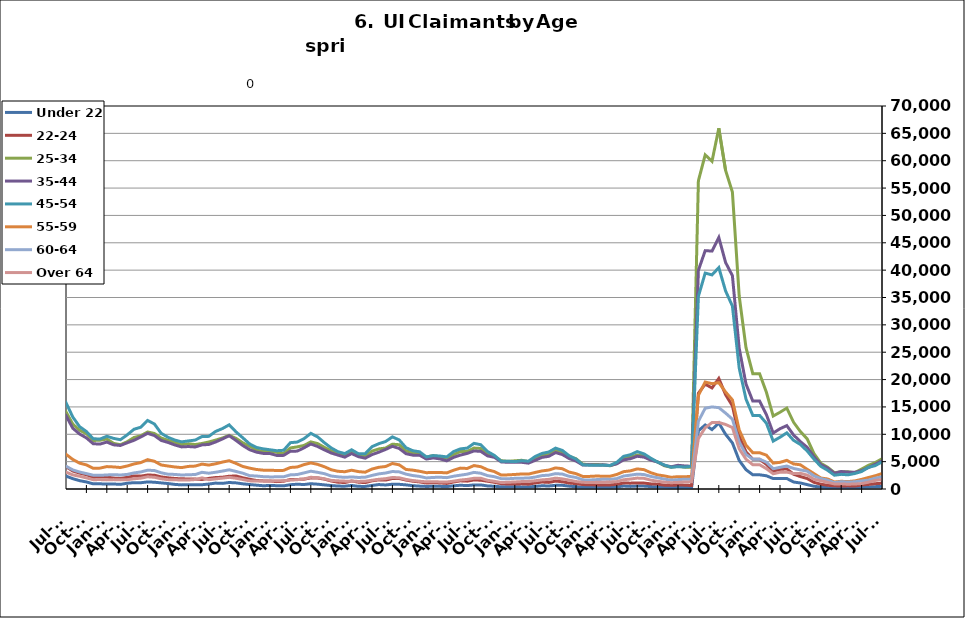
| Category | Under 22 | 22-24 | 25-34 | 35-44 | 45-54 | 55-59 | 60-64 | Over 64 |
|---|---|---|---|---|---|---|---|---|
| 1995-02-28 | 535 | 933 | 5740 | 6206 | 4029 | 1255 | 625 | 276 |
| 1995-03-31 | 534 | 992 | 5856 | 6433 | 4297 | 1294 | 686 | 323 |
| 1995-04-30 | 603 | 1125 | 6814 | 6965 | 4447 | 1392 | 730 | 338 |
| 1995-05-31 | 626 | 1171 | 7442 | 7404 | 4702 | 1383 | 751 | 333 |
| 1995-06-30 | 625 | 1218 | 7514 | 7778 | 4867 | 1435 | 813 | 366 |
| 1995-07-31 | 710 | 1296 | 8612 | 8864 | 5537 | 1595 | 891 | 407 |
| 1995-08-31 | 729 | 1248 | 8185 | 8719 | 5400 | 1604 | 982 | 406 |
| 1995-09-30 | 578 | 1028 | 6615 | 7150 | 4534 | 1351 | 862 | 338 |
| 1995-10-31 | 554 | 957 | 5805 | 6461 | 4159 | 1205 | 741 | 287 |
| 1995-11-30 | 468 | 845 | 5201 | 5826 | 3927 | 1155 | 702 | 254 |
| 1995-12-31 | 517 | 858 | 5350 | 5974 | 4010 | 1153 | 672 | 263 |
| 1996-01-31 | 543 | 927 | 5431 | 6086 | 4208 | 1221 | 685 | 301 |
| 1996-02-29 | 617 | 999 | 5667 | 6535 | 4480 | 1312 | 747 | 305 |
| 1996-03-31 | 622 | 981 | 5896 | 6557 | 4514 | 1362 | 763 | 306 |
| 1996-04-30 | 680 | 1140 | 7032 | 7649 | 5088 | 1527 | 856 | 345 |
| 1996-05-31 | 689 | 1163 | 7220 | 7819 | 5070 | 1521 | 832 | 366 |
| 1996-06-30 | 661 | 1145 | 7344 | 8173 | 5391 | 1568 | 844 | 388 |
| 1996-07-31 | 762 | 1250 | 8375 | 9181 | 6036 | 1755 | 973 | 432 |
| 1996-08-31 | 746 | 1145 | 7829 | 8585 | 5586 | 1651 | 950 | 435 |
| 1996-09-30 | 635 | 992 | 6399 | 7097 | 4790 | 1462 | 804 | 425 |
| 1996-10-31 | 572 | 851 | 5448 | 6291 | 4192 | 1259 | 693 | 340 |
| 1996-11-30 | 531 | 827 | 5003 | 5921 | 3908 | 1153 | 602 | 315 |
| 1996-12-31 | 521 | 789 | 4710 | 5510 | 3673 | 1110 | 610 | 284 |
| 1997-01-31 | 559 | 841 | 5203 | 6172 | 4321 | 1255 | 731 | 328 |
| 1997-02-28 | 556 | 841 | 5187 | 6162 | 4311 | 1250 | 727 | 326 |
| 1997-03-31 | 499 | 806 | 5125 | 6037 | 4176 | 1294 | 702 | 363 |
| 1997-04-30 | 545 | 885 | 5753 | 6709 | 4248 | 1339 | 734 | 339 |
| 1997-05-31 | 612 | 941 | 6146 | 7153 | 4458 | 1348 | 801 | 336 |
| 1997-06-30 | 623 | 995 | 6240 | 7298 | 4662 | 1302 | 776 | 348 |
| 1997-07-31 | 716 | 1154 | 7168 | 8554 | 5489 | 1509 | 903 | 415 |
| 1997-08-31 | 684 | 1072 | 6853 | 8093 | 5222 | 1487 | 837 | 416 |
| 1997-09-30 | 579 | 912 | 5522 | 6592 | 4348 | 1285 | 705 | 380 |
| 1997-10-31 | 516 | 817 | 4894.5 | 5892.5 | 3945 | 1159 | 625 | 344.5 |
| 1997-11-30 | 453 | 722 | 4267 | 5193 | 3542 | 1033 | 545 | 309 |
| 1997-12-31 | 413 | 682 | 3792 | 4755 | 3300 | 1023 | 490 | 266 |
| 1998-01-31 | 489 | 741 | 4044 | 5115 | 3513 | 1099 | 525 | 267 |
| 1998-02-28 | 435 | 684 | 3864 | 4903 | 3549 | 1043 | 571 | 285 |
| 1998-03-31 | 416 | 680 | 3855 | 5086 | 3703 | 1176 | 604 | 297 |
| 1998-04-30 | 592 | 813 | 5092 | 6219 | 4262 | 1336 | 688 | 332 |
| 1998-05-31 | 579 | 849 | 5319 | 6766 | 4554 | 1382 | 729 | 360 |
| 1998-06-30 | 568 | 899 | 5557 | 7101 | 4897 | 1405 | 783 | 367 |
| 1998-07-31 | 691 | 1031 | 6472 | 8095 | 5562 | 1589 | 880 | 392 |
| 1998-08-31 | 673 | 1007 | 6326 | 7950 | 5369 | 1574 | 935 | 393 |
| 1998-09-30 | 548 | 838 | 5206 | 6768 | 4703 | 1432 | 849 | 373 |
| 1998-10-31 | 496 | 776 | 4437 | 5582 | 3875 | 1250 | 711 | 302 |
| 1998-11-30 | 456 | 761 | 4182 | 5332 | 4015 | 1296 | 694 | 308 |
| 1998-12-31 | 442 | 722 | 4010 | 5198 | 4062 | 1331 | 656 | 290 |
| 1999-01-31 | 503 | 830 | 4502 | 5761 | 4521 | 1490 | 751 | 297 |
| 1999-02-28 | 463 | 756 | 4267 | 5576 | 4431 | 1470 | 767 | 301 |
| 1999-03-31 | 435 | 688 | 4119 | 5519 | 4403 | 1516 | 765 | 331 |
| 1999-04-30 | 591 | 949 | 5292 | 7089 | 5468 | 1724 | 914 | 489 |
| 1999-05-31 | 674 | 911 | 5611 | 7459 | 5457 | 1710 | 934 | 500 |
| 1999-06-30 | 640 | 906 | 5660 | 7503 | 5333 | 1695 | 920 | 495 |
| 1999-07-31 | 766 | 1132 | 6820 | 9256 | 6620 | 1981 | 1001 | 549 |
| 1999-08-31 | 738 | 1117 | 6737 | 9030 | 6670 | 2019 | 1075 | 582 |
| 1999-09-30 | 600 | 968 | 5167 | 7169 | 5458 | 1712 | 892 | 465 |
| 1999-10-31 | 494 | 813 | 4501 | 6048 | 4682 | 1443 | 743 | 363 |
| 1999-11-30 | 464 | 768 | 4228 | 5593 | 4564 | 1392 | 702 | 313 |
| 1999-12-31 | 468.5 | 754.5 | 4149 | 5486.5 | 4505 | 1429 | 673 | 304 |
| 2000-01-31 | 473 | 741 | 4070 | 5380 | 4446 | 1466 | 644 | 295 |
| 2000-02-29 | 460 | 691 | 3807 | 5357 | 4470 | 1469 | 707 | 310 |
| 2000-03-31 | 412 | 652 | 3864 | 5499 | 4568 | 1508 | 816 | 389 |
| 2000-04-30 | 585 | 829 | 4741 | 6891 | 5127 | 1631 | 906 | 451 |
| 2000-05-31 | 627 | 875 | 5086 | 7211 | 5238 | 1598 | 956 | 489 |
| 2000-06-30 | 675 | 983 | 5624 | 7826 | 5562 | 1669 | 941 | 524 |
| 2000-07-31 | 802 | 1109 | 6475 | 9102 | 6450 | 1927 | 1097 | 594 |
| 2000-08-31 | 787 | 1058 | 6045 | 8732 | 6157 | 1894 | 1085 | 616 |
| 2000-09-30 | 607 | 897 | 4766 | 6864 | 5037 | 1486 | 902 | 479 |
| 2000-10-31 | 544 | 760 | 4267 | 5897 | 4465 | 1323 | 762 | 394 |
| 2000-11-30 | 535 | 797 | 3982 | 5439 | 4318 | 1256 | 702 | 396 |
| 2000-12-31 | 508 | 832 | 3891 | 5255 | 4218 | 1246 | 694 | 361 |
| 2001-01-31 | 627 | 892 | 4229 | 5724 | 4777 | 1300 | 721 | 393 |
| 2001-02-28 | 643 | 934 | 4553 | 6302 | 5224 | 1529 | 849 | 472 |
| 2001-03-31 | 412 | 648 | 3625 | 5081 | 4551 | 1413 | 778 | 440 |
| 2001-04-30 | 875 | 1276 | 6577 | 8914 | 7196 | 2144 | 1185 | 639 |
| 2001-05-31 | 944 | 1399 | 7133 | 9570 | 7651 | 2265 | 1231 | 679 |
| 2001-06-30 | 1041 | 1584 | 8072 | 11034 | 8621 | 2613 | 1398 | 756 |
| 2001-07-31 | 1135 | 1806 | 9038 | 12514 | 9691 | 2970 | 1611 | 848 |
| 2001-08-31 | 1116 | 1776 | 8753 | 12045 | 9560 | 2963 | 1691 | 898 |
| 2001-09-30 | 1046 | 1705 | 8118 | 11025 | 8788 | 2784 | 1608 | 833 |
| 2001-10-31 | 1094 | 1785 | 8459 | 11114 | 8850 | 2772 | 1610 | 777 |
| 2001-11-30 | 1154 | 1931 | 9131 | 11576 | 9447 | 2973 | 1661 | 778 |
| 2001-12-31 | 1280 | 2191 | 9917 | 11961 | 9905 | 3152 | 1740 | 780 |
| 2002-01-31 | 1330 | 2255 | 10364 | 12730 | 10592 | 3378 | 1843 | 821 |
| 2002-02-28 | 1347 | 2339 | 10349 | 12730 | 10784 | 3499 | 1861 | 867 |
| 2002-03-31 | 1266 | 2231 | 9963 | 12747 | 10614 | 3499 | 1867 | 979 |
| 2002-04-30 | 1412 | 2488 | 11603 | 15825 | 13571 | 4631 | 2389 | 1146 |
| 2002-05-31 | 1455 | 2421 | 11243 | 15509 | 13148 | 4374 | 2359 | 1195 |
| 2002-06-30 | 1534 | 2479 | 11416 | 15594 | 13261 | 4343 | 2365 | 1180 |
| 2002-07-31 | 1513 | 2614 | 11895 | 16242 | 13727 | 4439 | 2428 | 1255 |
| 2002-08-31 | 1022 | 1977 | 8719 | 12054 | 10588 | 3454 | 1990 | 1047 |
| 2002-09-30 | 1391 | 2528 | 10478 | 14010 | 12008 | 3847 | 2161 | 1166 |
| 2002-10-31 | 1401 | 2385 | 9826 | 12727 | 10778 | 3498 | 1886 | 973 |
| 2002-11-30 | 1344 | 2390 | 9846 | 12059 | 10297 | 3367 | 1833 | 958 |
| 2002-12-31 | 1311 | 2403 | 9841 | 11670 | 10177 | 3369 | 1871 | 894 |
| 2003-01-31 | 1311 | 2403 | 9841 | 11670 | 10177 | 3369 | 1871 | 894 |
| 2003-02-28 | 1367 | 2275 | 9730 | 12433 | 10806 | 3687 | 2016 | 974 |
| 2003-03-31 | 1367 | 2357 | 9844 | 12620 | 11167 | 3825 | 2151 | 1094 |
| 2003-04-30 | 1549 | 2525 | 10619 | 14142 | 12182 | 4004 | 2304 | 1190 |
| 2003-05-31 | 1663 | 2698 | 10843 | 14795 | 12539 | 4102 | 2395 | 1256 |
| 2003-06-30 | 1755 | 2770 | 11350 | 15575 | 13251 | 4301 | 2493 | 1325 |
| 2003-07-31 | 1748 | 2791 | 11577 | 15863 | 13772 | 4465 | 2593 | 1371 |
| 2003-08-31 | 1718 | 2653 | 10998 | 15261 | 13219 | 4325 | 2522 | 1359 |
| 2003-09-30 | 1494 | 2521 | 10071 | 13565 | 11659 | 3828 | 2278 | 1286 |
| 2003-10-31 | 1329 | 2432 | 9388 | 12107 | 10693 | 3567 | 2036 | 1129 |
| 2003-11-30 | 1191 | 2226 | 8954 | 11297 | 10037 | 3414 | 2004 | 1068 |
| 2003-12-31 | 1206 | 2184 | 8530 | 10413 | 9335 | 3215 | 1854 | 994 |
| 2004-01-31 | 1216 | 2171 | 8382 | 9858 | 8955 | 2992 | 1736 | 963 |
| 2004-02-29 | 1118 | 1879 | 7614 | 8935 | 8176 | 2761 | 1617 | 943 |
| 2004-03-31 | 1099 | 1749 | 7152 | 8565 | 7769 | 2686 | 1608 | 981 |
| 2004-04-30 | 1241 | 1951 | 7653 | 9981 | 8741 | 2872 | 1685 | 1056 |
| 2004-05-31 | 1245 | 1934 | 7651 | 10203 | 8820 | 2928 | 1703 | 1079 |
| 2004-06-30 | 1316 | 2086 | 8172 | 10636 | 9362 | 3146 | 1843 | 1081 |
| 2004-07-31 | 1476 | 2265 | 8795 | 11511 | 10439 | 3497 | 2008 | 1171 |
| 2004-08-31 | 1390 | 2055 | 8008 | 10418 | 9514 | 3304 | 1909 | 1105 |
| 2004-09-30 | 1129 | 1820 | 6987 | 8661 | 7694 | 2755 | 1623 | 1046 |
| 2004-10-31 | 1037 | 1675 | 6590 | 7964 | 7029 | 2459 | 1461 | 882 |
| 2004-11-30 | 954 | 1638 | 6342 | 7570 | 6733 | 2294 | 1383 | 841 |
| 2004-12-31 | 857 | 1533 | 5921 | 6991 | 6333 | 2225 | 1287 | 764 |
| 2005-01-31 | 893 | 1539 | 6047 | 7410 | 6682 | 2253 | 1274 | 788 |
| 2005-02-28 | 846 | 1361 | 5650 | 6952 | 6404 | 2198 | 1326 | 786 |
| 2005-03-31 | 747 | 1258 | 5313 | 6595 | 6251 | 2151 | 1327 | 742 |
| 2005-04-30 | 877 | 1375 | 5696 | 7717 | 7230 | 2440 | 1401 | 844 |
| 2005-05-31 | 854 | 1408 | 5674 | 7905 | 7454 | 2482 | 1453 | 858 |
| 2005-06-30 | 819 | 1444 | 6028 | 8565 | 7899 | 2613 | 1547 | 890 |
| 2005-07-31 | 900 | 1461 | 6395 | 9124 | 8614 | 2864 | 1640 | 1004 |
| 2005-08-31 | 805 | 1439 | 5917 | 8271 | 8076 | 2692 | 1587 | 945 |
| 2005-09-30 | 631 | 1209 | 4978 | 6413 | 6203 | 2116 | 1312 | 724 |
| 2005-10-31 | 638 | 1134 | 4602 | 6028 | 5688 | 1997 | 1171 | 656 |
| 2005-11-30 | 564 | 1071 | 4409 | 5563 | 5105 | 1791 | 1035 | 580 |
| 2005-12-31 | 523 | 987 | 4014 | 4983 | 4531 | 1673 | 968 | 546 |
| 2006-01-31 | 531 | 925 | 3900 | 5012 | 4793 | 1691 | 1008 | 539 |
| 2006-02-28 | 447 | 804 | 3534 | 4388 | 4403 | 1586 | 980 | 549 |
| 2006-03-31 | 399 | 785 | 3455 | 4472 | 4584 | 1680 | 1069 | 618 |
| 2006-04-30 | 527 | 945 | 4004 | 5859 | 5921 | 1965 | 1251 | 744 |
| 2006-05-31 | 594 | 964 | 4205 | 6365 | 6369 | 2156 | 1327 | 792 |
| 2006-06-30 | 660 | 1113 | 4742 | 7052 | 7094 | 2386 | 1474 | 933 |
| 2006-07-31 | 771 | 1183 | 5214 | 7974 | 8007 | 2685 | 1635 | 1072 |
| 2006-08-31 | 737 | 1202 | 5116 | 7524 | 7553 | 2671 | 1590 | 1019 |
| 2006-09-30 | 596 | 1086 | 4608 | 6175 | 6389 | 2256 | 1287 | 812 |
| 2006-10-31 | 596 | 1056 | 4585 | 5758 | 5788 | 2026 | 1164 | 696 |
| 2006-11-30 | 542 | 1003 | 4370 | 5304 | 5388 | 1812 | 1082 | 604 |
| 2006-12-31 | 553 | 1102 | 4425 | 5291 | 5310 | 1801 | 1099 | 603 |
| 2007-01-31 | 587 | 1147 | 4542 | 5619 | 5506 | 1920 | 1174 | 663 |
| 2007-02-28 | 544 | 1090 | 4490 | 5562 | 5616 | 1982 | 1260 | 705 |
| 2007-03-31 | 558 | 1089 | 4498 | 5595 | 5708 | 2016 | 1378 | 717 |
| 2007-04-30 | 760 | 1203 | 5015 | 6827 | 6871 | 2316 | 1536 | 856 |
| 2007-05-31 | 806 | 1285 | 5542 | 7679 | 7763 | 2571 | 1719 | 1021 |
| 2007-06-30 | 862 | 1340 | 6100 | 8324 | 8341 | 2812 | 1896 | 1060 |
| 2007-07-31 | 980 | 1524 | 6616 | 9184 | 9522 | 3226 | 2038 | 1250 |
| 2007-08-31 | 950 | 1510 | 6266 | 8359 | 8842 | 3033 | 1949 | 1157 |
| 2007-09-30 | 865 | 1595 | 6213 | 7798 | 7957 | 2790 | 1816 | 1090 |
| 2007-10-31 | 883 | 1517 | 6214 | 7229 | 7503 | 2574 | 1630 | 978 |
| 2007-11-15 | 816 | 1424 | 5981 | 6740 | 6999 | 2468 | 1510 | 860 |
| 2007-12-15 09:36:00 | 851 | 1536 | 6411 | 6986 | 7174 | 2572 | 1584 | 874 |
| 2008-01-14 19:12:00 | 963 | 1628 | 6836 | 7533 | 7742 | 2786 | 1744 | 940 |
| 2008-02-14 04:48:00 | 982 | 1565 | 6847 | 7767 | 8031 | 2958 | 1823 | 985 |
| 2008-03-15 14:24:00 | 1029 | 1666 | 7210 | 8036 | 8353 | 3105 | 1898 | 1085 |
| 2008-04-15 | 1182 | 1889 | 7894 | 9339 | 9822 | 3537 | 2184 | 1246 |
| 2008-05-15 09:36:00 | 1325 | 2099 | 8651 | 10315 | 11003 | 3871 | 2423 | 1448 |
| 2008-06-14 19:12:00 | 1405 | 2238 | 9567 | 11330 | 12040 | 4322 | 2650 | 1572 |
| 2008-07-15 04:48:00 | 1616 | 2488 | 10336 | 12349 | 13396 | 4698 | 3083 | 1801 |
| 2008-08-14 14:24:00 | 1753 | 2665 | 10716 | 12486 | 13444 | 4795 | 3139 | 1802 |
| 2008-09-14 | 1800 | 2924 | 11552 | 12686 | 13602 | 4801 | 3180 | 1811 |
| 2008-10-14 09:36:00 | 1936 | 3131 | 12284 | 13322 | 13831 | 4989 | 3183 | 1808 |
| 2008-11-13 19:12:00 | 2093 | 3414 | 13577 | 14724 | 15130 | 5413 | 3440 | 1946 |
| 2008-12-14 04:48:00 | 2495 | 4020 | 15380 | 16325 | 16846 | 6098 | 3755 | 2155 |
| 2009-01-13 14:24:00 | 3054 | 4678 | 17678 | 18452 | 19095 | 6788 | 4182 | 2364 |
| 2009-02-13 | 3531 | 5304 | 19793 | 20788 | 21601 | 7727 | 4836 | 2718 |
| 2009-03-15 09:36:00 | 3891 | 5925 | 22303 | 23139 | 24352 | 8876 | 5515 | 3141 |
| 2009-04-14 19:12:00 | 4291 | 6403 | 23925 | 25362 | 26817 | 9618 | 6020 | 3494 |
| 2009-05-15 04:48:00 | 4410 | 6521 | 24301 | 25794 | 27238 | 9735 | 6181 | 3529 |
| 2009-06-14 14:24:00 | 4405 | 6853 | 25234 | 26806 | 28296 | 10256 | 6673 | 3804 |
| 2009-07-15 | 4729 | 7280 | 26132 | 27836 | 29724 | 10830 | 6950 | 4125 |
| 2009-08-14 09:36:00 | 4717 | 7069 | 25281 | 26184 | 27877 | 10164 | 6719 | 3918 |
| 2009-09-13 19:12:00 | 4741 | 7291 | 25029 | 24981 | 26018 | 9679 | 6210 | 3594 |
| 2009-10-14 04:48:00 | 4656 | 7051 | 24241 | 23779 | 24730 | 9034 | 5817 | 3422 |
| 2009-11-13 14:24:00 | 4421 | 6817 | 23760 | 22851 | 23515 | 8627 | 5549 | 3297 |
| 2009-12-14 | 4232 | 6586 | 23118 | 22038 | 22501 | 8496 | 5370 | 3295 |
| 2010-01-13 09:36:00 | 4276 | 6583 | 22706 | 21421 | 22132 | 8135 | 5154 | 3134 |
| 2010-02-12 19:12:00 | 4133 | 6142 | 21386 | 20012 | 21036 | 7728 | 5039 | 3047 |
| 2010-03-15 04:48:00 | 3784 | 5822 | 20418 | 19073 | 20556 | 7446 | 4983 | 3062 |
| 2010-04-14 14:24:00 | 3731 | 5751 | 20058 | 19261 | 21012 | 7449 | 5078 | 2936 |
| 2010-05-15 | 3516 | 5553 | 19393 | 18793 | 20409 | 7213 | 4923 | 2915 |
| 2010-06-14 09:36:00 | 3450 | 5640 | 19615 | 19385 | 20781 | 7547 | 5293 | 3043 |
| 2010-07-14 19:12:00 | 3536 | 5781 | 19820 | 19714 | 21269 | 7946 | 5439 | 3330 |
| 2010-08-14 04:48:00 | 3477 | 5590 | 18902 | 18548 | 19686 | 7561 | 5039 | 3181 |
| 2010-09-13 14:24:00 | 3083 | 5332 | 17344 | 16712 | 17408 | 6775 | 4612 | 2859 |
| 2010-10-14 | 3004 | 5138 | 17187 | 16492 | 17042 | 6713 | 4418 | 2779 |
| 2010-11-13 09:36:00 | 2724 | 4771 | 16387 | 15438 | 16061 | 6360 | 4209 | 2601 |
| 2010-12-13 19:12:00 | 2335 | 4159 | 15175 | 14143 | 14646 | 5823 | 4003 | 2480 |
| 2011-01-13 04:48:00 | 2530 | 4343 | 15492 | 14596 | 15561 | 6250 | 4059 | 2487 |
| 2011-02-12 14:24:00 | 2609 | 4202 | 15131 | 14142 | 15320 | 6044 | 4041 | 2517 |
| 2011-03-15 | 2290 | 3998 | 14370 | 13505 | 14523 | 5925 | 3990 | 2470 |
| 2011-04-14 09:36:00 | 2563 | 4190 | 14834 | 14445 | 15508 | 6130 | 3916 | 2488 |
| 2011-05-14 19:12:00 | 2642 | 4217 | 14917 | 14494 | 16051 | 6156 | 4129 | 2602 |
| 2011-06-14 04:48:00 | 2767 | 4676 | 17673 | 17404 | 19563 | 7763 | 5398 | 3653 |
| 2011-07-14 14:24:00 | 3027 | 4815 | 17530 | 17197 | 19880 | 7870 | 5384 | 3686 |
| 2011-08-14 | 2900 | 4498 | 15970 | 15020 | 17035 | 6697 | 4394 | 2956 |
| 2011-09-13 09:36:00 | 2531 | 4156 | 14609 | 13818 | 15092 | 5903 | 3881 | 2687 |
| 2011-10-13 19:12:00 | 2452 | 3959 | 14501 | 13415 | 14565 | 5635 | 3734 | 2491 |
| 2011-11-13 04:48:00 | 2197 | 3615 | 13732 | 12410 | 13698 | 5345 | 3574 | 2339 |
| 2011-12-13 14:24:00 | 1938 | 3290 | 13130 | 11646 | 13054 | 5089 | 3380 | 2177 |
| 2012-01-13 | 2098 | 3424 | 13293 | 11897 | 13400 | 5218 | 3448 | 2197 |
| 2012-02-12 09:36:00 | 2047 | 3428 | 12569 | 11400 | 12931 | 5177 | 3445 | 2212 |
| 2012-03-13 19:12:00 | 1870 | 3252 | 11913 | 10922 | 12476 | 4948 | 3317 | 2155 |
| 2012-04-13 04:48:00 | 2063 | 3590 | 12479 | 11814 | 13464 | 5278 | 3509 | 2287 |
| 2012-05-13 14:24:00 | 2260 | 3828 | 12852 | 12063 | 14139 | 5562 | 3628 | 2485 |
| 2012-06-13 | 2147 | 3747 | 13008 | 12659 | 14694 | 5791 | 3902 | 2736 |
| 2012-07-13 09:36:00 | 2358 | 4087 | 14109 | 13412 | 15770 | 6346 | 4156 | 3086 |
| 2012-08-12 19:12:00 | 1887 | 3284 | 11852 | 11102 | 13153 | 5396 | 3487 | 2583 |
| 2012-09-12 04:48:00 | 1524 | 2903 | 10742 | 10051 | 11393 | 4726 | 3103 | 2327 |
| 2012-10-12 14:24:00 | 1289 | 2603 | 10123 | 9339 | 10510 | 4405 | 2813 | 2032 |
| 2012-11-12 | 945 | 2155 | 8870 | 8273 | 9193 | 3781 | 2520 | 1702 |
| 2012-12-12 09:36:00 | 937 | 2201 | 8913 | 8210 | 9124 | 3816 | 2491 | 1722 |
| 2013-01-11 19:12:00 | 934 | 2199 | 9132 | 8579 | 9635 | 4095 | 2569 | 1667 |
| 2013-02-11 04:48:00 | 915 | 1996 | 8343 | 8072 | 9253 | 4034 | 2623 | 1715 |
| 2013-03-13 14:24:00 | 845 | 1934 | 8092 | 7955 | 9007 | 3929 | 2561 | 1667 |
| 2013-04-13 | 1055 | 2124 | 8637 | 8445 | 9891 | 4204 | 2666 | 1698 |
| 2013-05-13 09:36:00 | 1160 | 2394 | 9413 | 8898 | 10920 | 4574 | 2940 | 1871 |
| 2013-06-12 19:12:00 | 1145 | 2351 | 9732 | 9510 | 11293 | 4830 | 3115 | 1976 |
| 2013-07-13 04:48:00 | 1294 | 2558 | 10421 | 10174 | 12520 | 5363 | 3434 | 2233 |
| 2013-08-12 14:24:00 | 1238 | 2519 | 10150 | 9771 | 11886 | 5067 | 3372 | 2140 |
| 2013-09-12 | 1116 | 2214 | 9323 | 8874 | 10178 | 4389 | 2964 | 1871 |
| 2013-10-12 09:36:00 | 1000 | 2044 | 8893 | 8509 | 9449 | 4200 | 2701 | 1709 |
| 2013-11-11 19:12:00 | 842 | 1927 | 8532 | 8049 | 8950 | 4028 | 2665 | 1675 |
| 2013-12-12 04:48:00 | 753 | 1854 | 8098 | 7692 | 8612 | 3913 | 2557 | 1655 |
| 2014-01-11 14:24:00 | 788 | 1846 | 8270 | 7762 | 8786 | 4128 | 2606 | 1642 |
| 2014-02-11 | 795 | 1817 | 8124 | 7677 | 8944 | 4189 | 2646 | 1728 |
| 2014-03-13 09:36:00 | 782 | 1741 | 8319 | 8063 | 9583 | 4550 | 3048 | 2040 |
| 2014-04-12 19:12:00 | 905 | 1940 | 8594 | 8138 | 9620 | 4372 | 2886 | 1706 |
| 2014-05-13 04:48:00 | 1079 | 2093 | 8933 | 8593 | 10522 | 4609 | 3062 | 1850 |
| 2014-06-12 14:24:00 | 1028 | 2152 | 9323 | 9148 | 11040 | 4920 | 3274 | 1985 |
| 2014-07-13 | 1189 | 2333 | 9808 | 9735 | 11729 | 5171 | 3509 | 2133 |
| 2014-08-14 | 1119 | 2379 | 9259 | 8876 | 10438 | 4678 | 3210 | 1962 |
| 2014-09-13 09:36:00 | 943 | 2048 | 8430 | 7946 | 9358 | 4119 | 2891 | 1734 |
| 2014-10-13 19:12:00 | 816 | 1781 | 7821 | 7185 | 8244 | 3813 | 2437 | 1486 |
| 2014-11-13 04:48:00 | 703 | 1557 | 7150 | 6736 | 7594 | 3571 | 2374 | 1466 |
| 2014-12-13 14:24:00 | 597 | 1482 | 6833 | 6507 | 7340 | 3442 | 2255 | 1458 |
| 2015-01-13 | 646 | 1466 | 6927 | 6477 | 7168 | 3432 | 2210 | 1429 |
| 2015-02-12 09:36:00 | 607 | 1346 | 6696 | 6134 | 6999 | 3383 | 2220 | 1525 |
| 2015-03-14 19:12:00 | 577 | 1416 | 6499 | 6145 | 7077 | 3405 | 2233 | 1530 |
| 2015-04-14 04:48:00 | 784 | 1736 | 7505 | 6901 | 8468 | 3935 | 2586 | 1624 |
| 2015-05-14 14:24:00 | 875 | 1749 | 7696 | 6925 | 8578 | 4020 | 2644 | 1698 |
| 2015-06-14 | 818 | 1789 | 7961 | 7519 | 9200 | 4452 | 2943 | 1839 |
| 2015-07-14 09:36:00 | 966 | 2033 | 8609 | 8223 | 10167 | 4766 | 3254 | 2136 |
| 2015-08-13 19:12:00 | 880 | 2007 | 8302 | 7779 | 9530 | 4503 | 3045 | 2073 |
| 2015-09-13 04:48:00 | 752 | 1807 | 7615 | 7153 | 8455 | 4067 | 2798 | 1870 |
| 2015-10-13 14:24:00 | 630 | 1461 | 6995 | 6578 | 7509 | 3519 | 2375 | 1570 |
| 2015-11-13 | 533 | 1246 | 6491 | 6196 | 6815 | 3237 | 2224 | 1493 |
| 2015-12-13 09:36:00 | 512 | 1179 | 6242 | 5823 | 6474 | 3158 | 2123 | 1439 |
| 2016-01-12 19:12:00 | 646 | 1466 | 6927 | 6477 | 7168 | 3432 | 2210 | 1429 |
| 2016-02-12 04:48:00 | 482 | 1246 | 6101 | 5912 | 6452 | 3180 | 2110 | 1385 |
| 2016-03-13 14:24:00 | 474 | 1170 | 6011 | 5629 | 6452 | 3073 | 2152 | 1420 |
| 2016-04-13 | 648 | 1494 | 6917 | 6287 | 7737 | 3648 | 2483 | 1600 |
| 2016-05-13 09:36:00 | 812 | 1670 | 7326 | 6725 | 8279 | 3967 | 2765 | 1776 |
| 2016-06-12 19:12:00 | 738 | 1622 | 7479 | 7230 | 8681 | 4111 | 2920 | 1886 |
| 2016-07-13 04:48:00 | 875 | 1919 | 8193 | 7814 | 9525 | 4662 | 3196 | 2105 |
| 2016-08-12 14:24:00 | 858 | 1920 | 8091 | 7407 | 8969 | 4420 | 3130 | 2050 |
| 2016-09-12 | 752 | 1632 | 6992 | 6450 | 7548 | 3573 | 2713 | 1747 |
| 2016-10-12 09:36:00 | 602 | 1423 | 6590 | 6190 | 6998 | 3448 | 2457 | 1544 |
| 2016-11-11 19:12:00 | 523 | 1296 | 6418 | 6179 | 6801 | 3241 | 2299 | 1410 |
| 2016-12-12 04:48:00 | 468 | 1096 | 5827 | 5472 | 5867 | 2981 | 2019 | 1311 |
| 2017-01-11 14:24:00 | 495 | 1150 | 6111 | 5679 | 6108 | 3035 | 2115 | 1342 |
| 2017-02-11 | 484 | 1109 | 5882 | 5500 | 6023 | 3023 | 2148 | 1289 |
| 2017-03-13 09:36:00 | 442 | 1015 | 5634 | 5148 | 5865 | 2942 | 2075 | 1278 |
| 2017-04-12 19:12:00 | 585 | 1285 | 6292 | 5783 | 6842 | 3434 | 2336 | 1435 |
| 2017-05-13 04:48:00 | 686 | 1492 | 6844 | 6200 | 7332 | 3817 | 2526 | 1637 |
| 2017-06-12 14:24:00 | 623 | 1435 | 6852 | 6505 | 7473 | 3751 | 2713 | 1754 |
| 2017-07-13 | 745 | 1658 | 7483 | 6953 | 8339 | 4284 | 3038 | 1964 |
| 2017-08-12 09:36:00 | 745 | 1605 | 7411 | 6880 | 8092 | 4080 | 2878 | 1966 |
| 2017-09-11 19:12:00 | 559 | 1420 | 6481 | 6045 | 6845 | 3511 | 2443 | 1591 |
| 2017-10-12 04:48:00 | 503 | 1224 | 5960 | 5790 | 6135 | 3181 | 2245 | 1400 |
| 2017-11-11 14:24:00 | 390 | 972 | 5167 | 4951 | 5077 | 2553 | 1887 | 1188 |
| 2017-12-12 | 413 | 914 | 5058 | 4876 | 5071 | 2585 | 1870 | 1226 |
| 2018-01-11 09:36:00 | 411 | 912 | 5154 | 4909 | 5000 | 2656 | 1952 | 1288 |
| 2018-02-10 19:12:00 | 383 | 940 | 5246 | 4884 | 5165 | 2743 | 1980 | 1355 |
| 2018-03-13 04:48:00 | 373 | 875 | 5018 | 4724 | 5075 | 2723 | 1999 | 1389 |
| 2018-04-12 14:24:00 | 478 | 1104 | 5584 | 5240 | 5944 | 3026 | 2179 | 1506 |
| 2018-05-13 | 586 | 1275 | 6280 | 5780 | 6500 | 3300 | 2452 | 1670 |
| 2018-06-12 09:36:00 | 554 | 1207 | 6302 | 5974 | 6766 | 3462 | 2534 | 1762 |
| 2018-07-12 19:12:00 | 666 | 1445 | 7024 | 6656 | 7473 | 3858 | 2810 | 1989 |
| 2018-08-12 04:48:00 | 671 | 1323 | 6823 | 6293 | 7046 | 3706 | 2722 | 1850 |
| 2018-09-11 14:24:00 | 518 | 1084 | 5965 | 5563 | 6066 | 3091 | 2318 | 1618 |
| 2018-10-12 | 419 | 985 | 5538 | 5106 | 5464 | 2806 | 2102 | 1367 |
| 2018-11-11 09:36:00 | 306 | 808 | 4542 | 4371 | 4433 | 2297 | 1673 | 1222 |
| 2018-12-11 19:12:00 | 328 | 771 | 4439 | 4429 | 4340 | 2303 | 1646 | 1174 |
| 2019-01-11 04:48:00 | 327 | 743 | 4491 | 4378 | 4359 | 2368 | 1715 | 1218 |
| 2019-02-10 14:24:00 | 338 | 739 | 4402 | 4415 | 4345 | 2337 | 1773 | 1237 |
| 2019-03-13 | 306 | 738 | 4246 | 4293 | 4304 | 2328 | 1756 | 1281 |
| 2019-04-12 09:36:00 | 396 | 850 | 4657 | 4603 | 4871 | 2655 | 1900 | 1347 |
| 2019-05-12 19:12:00 | 541 | 1092 | 5700 | 5319 | 5974 | 3169 | 2371 | 1690 |
| 2019-06-12 04:48:00 | 476 | 1070 | 5822 | 5537 | 6262 | 3317 | 2534 | 1820 |
| 2019-07-12 14:24:00 | 538 | 1114 | 6206 | 5980 | 6836 | 3673 | 2717 | 1996 |
| 2019-08-12 | 528 | 1084 | 6044 | 5828 | 6422 | 3535 | 2645 | 1942 |
| 2019-09-11 09:36:00 | 445 | 932 | 5379 | 5275 | 5630 | 2979 | 2299 | 1624 |
| 2019-10-11 19:12:00 | 372 | 877 | 4949 | 4938 | 4922 | 2579 | 2058 | 1418 |
| 2019-11-11 04:48:00 | 332 | 701 | 4242 | 4332 | 4379 | 2392 | 1809 | 1247 |
| 2019-12-11 14:24:00 | 261 | 663 | 3977 | 4071 | 3974 | 2137 | 1619 | 1150 |
| 2020-01-11 | 272 | 724 | 4153 | 4331 | 4085 | 2258 | 1715 | 1206 |
| 2020-02-10 09:36:00 | 274 | 704 | 3992 | 4211 | 4020 | 2226 | 1784 | 1286 |
| 2020-03-11 19:12:00 | 291 | 630 | 3985 | 4153 | 4136 | 2332 | 1794 | 1308 |
| 2020-04-11 04:48:00 | 10628 | 17510 | 56346 | 39970 | 35225 | 17140 | 12379 | 9237 |
| 2020-05-11 14:24:00 | 11700 | 19159 | 61067 | 43562 | 39459 | 19553 | 14765 | 11197 |
| 2020-06-11 | 10859 | 18470 | 59897 | 43484 | 39131 | 19246 | 15000 | 12140 |
| 2020-07-11 09:36:00 | 12066 | 20204 | 65924 | 45983 | 40459 | 19436 | 14870 | 12160 |
| 2020-08-10 19:12:00 | 9989 | 17237 | 58218 | 41395 | 36191 | 17725 | 13875 | 11793 |
| 2020-09-10 04:48:00 | 8425 | 15201 | 54260 | 38988 | 33440 | 16290 | 12758 | 11237 |
| 2020-10-10 14:24:00 | 5224 | 9693 | 35264 | 25722 | 22091 | 10801 | 8611 | 7331 |
| 2020-11-10 | 3533 | 6796 | 25816 | 19183 | 16424 | 8018 | 6314 | 5449 |
| 2020-12-10 09:36:00 | 2593 | 5424 | 21071 | 16063 | 13455 | 6630 | 5449 | 4436 |
| 2021-01-09 19:12:00 | 2593 | 5424 | 21071 | 16063 | 13455 | 6630 | 5449 | 4436 |
| 2021-02-09 04:48:00 | 2420 | 4500 | 17683 | 13595 | 12022 | 6183 | 4899 | 3716 |
| 2021-03-11 14:24:00 | 1905 | 3249 | 13332 | 10225 | 8752 | 4732 | 3708 | 2781 |
| 2021-04-11 | 1938 | 3581 | 14034 | 11018 | 9457 | 4873 | 3962 | 3063 |
| 2021-05-11 09:36:00 | 1918 | 3672 | 14797 | 11584 | 10265 | 5238 | 4196 | 3085 |
| 2021-06-10 19:12:00 | 1277 | 2699 | 12194 | 9866 | 8892 | 4577 | 3756 | 2811 |
| 2021-07-11 04:48:00 | 1101 | 2270 | 10491 | 8653 | 8141 | 4427 | 3493 | 2859 |
| 2021-08-10 14:24:00 | 802 | 1912 | 9154 | 7615 | 6945 | 3597 | 3259 | 2545 |
| 2021-09-10 | 499 | 1209 | 6458 | 5895 | 5459 | 2812 | 2399 | 1777 |
| 2021-10-10 09:36:00 | 363 | 875 | 4718 | 4474 | 4141 | 2009 | 1903 | 1513 |
| 2021-11-09 19:12:00 | 251 | 681 | 3999 | 3834 | 3423 | 1835 | 1611 | 1206 |
| 2021-12-10 04:48:00 | 194 | 580 | 2968 | 2881 | 2517 | 1278 | 1152 | 925 |
| 2022-01-09 14:24:00 | 189 | 547 | 3143 | 3194 | 2678 | 1410 | 1338 | 928 |
| 2022-02-09 | 183 | 575 | 3165 | 3086 | 2590 | 1357 | 1270 | 874 |
| 2022-03-11 09:36:00 | 219 | 541 | 2988 | 3043 | 2829 | 1476 | 1313 | 912 |
| 2022-04-10 19:12:00 | 308 | 723 | 3641 | 3357 | 3189 | 1758 | 1482 | 986 |
| 2022-05-11 04:48:00 | 365 | 837 | 4299 | 3915 | 3953 | 2098 | 1624 | 1241 |
| 2022-06-10 14:24:00 | 427 | 969 | 4818 | 4519 | 4269 | 2418 | 1965 | 1563 |
| 2022-07-11 | 494 | 1055 | 5515 | 5179 | 4951 | 2831 | 2235 | 1736 |